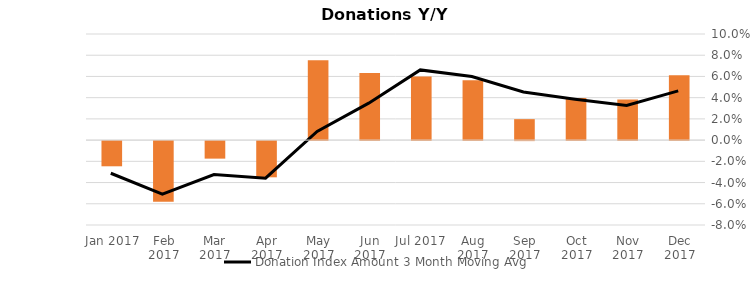
| Category | Donation Index Amount Y/Y Growth |
|---|---|
| Dec 2017 | 0.061 |
| Nov 2017 | 0.038 |
| Oct 2017 | 0.04 |
| Sep 2017 | 0.02 |
| Aug 2017 | 0.056 |
| Jul 2017 | 0.06 |
| Jun 2017 | 0.063 |
| May 2017 | 0.075 |
| Apr 2017 | -0.034 |
| Mar 2017 | -0.017 |
| Feb 2017 | -0.057 |
| Jan 2017 | -0.024 |